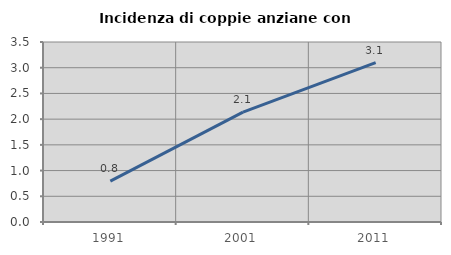
| Category | Incidenza di coppie anziane con figli |
|---|---|
| 1991.0 | 0.794 |
| 2001.0 | 2.135 |
| 2011.0 | 3.1 |